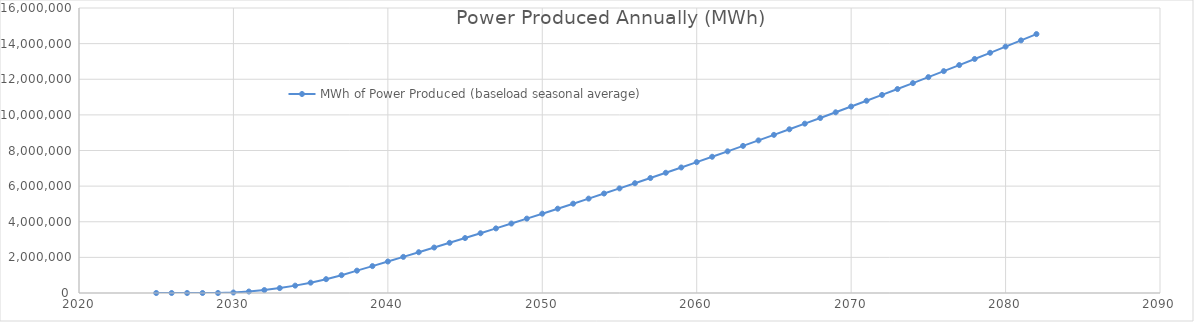
| Category | MWh of Power Produced (baseload seasonal average) |
|---|---|
| 2025.0 | 0 |
| 2026.0 | 0 |
| 2027.0 | 0 |
| 2028.0 | 0 |
| 2029.0 | 0 |
| 2030.0 | 27377.537 |
| 2031.0 | 82132.61 |
| 2032.0 | 164807.038 |
| 2033.0 | 275400.82 |
| 2034.0 | 413913.958 |
| 2035.0 | 580888.267 |
| 2036.0 | 776865.568 |
| 2037.0 | 1001304.041 |
| 2038.0 | 1254745.505 |
| 2039.0 | 1510354.242 |
| 2040.0 | 1768130.25 |
| 2041.0 | 2027531.712 |
| 2042.0 | 2289100.447 |
| 2043.0 | 2552294.636 |
| 2044.0 | 2817656.097 |
| 2045.0 | 3085184.83 |
| 2046.0 | 3354880.835 |
| 2047.0 | 3626202.294 |
| 2048.0 | 3899691.026 |
| 2049.0 | 4175347.029 |
| 2050.0 | 4453170.305 |
| 2051.0 | 4733160.853 |
| 2052.0 | 5014776.855 |
| 2053.0 | 5298560.129 |
| 2054.0 | 5584510.675 |
| 2055.0 | 5872628.494 |
| 2056.0 | 6162913.584 |
| 2057.0 | 6455365.947 |
| 2058.0 | 6749985.582 |
| 2059.0 | 7047314.307 |
| 2060.0 | 7346810.304 |
| 2061.0 | 7648473.574 |
| 2062.0 | 7952304.115 |
| 2063.0 | 8258301.929 |
| 2064.0 | 8567008.833 |
| 2065.0 | 8877883.009 |
| 2066.0 | 9190924.457 |
| 2067.0 | 9506674.995 |
| 2068.0 | 9824592.806 |
| 2069.0 | 10144677.889 |
| 2070.0 | 10467472.061 |
| 2071.0 | 10792433.506 |
| 2072.0 | 11120104.042 |
| 2073.0 | 11450483.667 |
| 2074.0 | 11783030.564 |
| 2075.0 | 12118286.552 |
| 2076.0 | 12455709.812 |
| 2077.0 | 12795842.162 |
| 2078.0 | 13138683.602 |
| 2079.0 | 13484234.133 |
| 2080.0 | 13831951.935 |
| 2081.0 | 14182378.828 |
| 2082.0 | 14535514.811 |